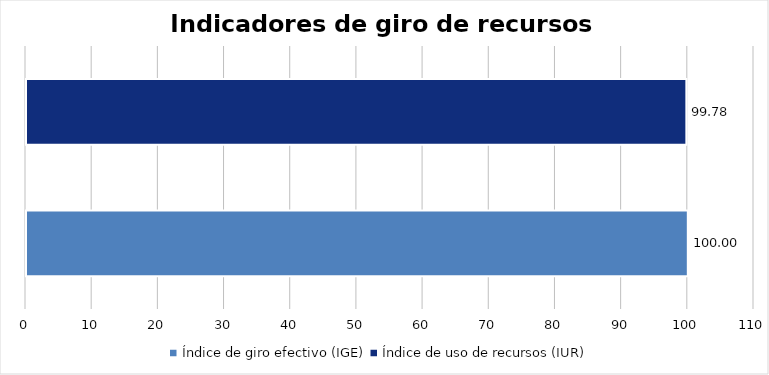
| Category | Series 0 |
|---|---|
| Índice de giro efectivo (IGE) | 100 |
| Índice de uso de recursos (IUR)  | 99.78 |